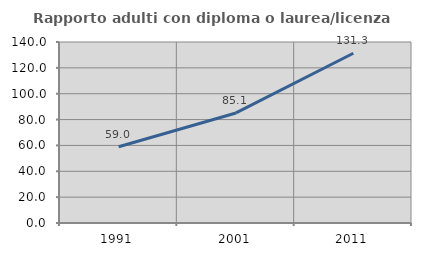
| Category | Rapporto adulti con diploma o laurea/licenza media  |
|---|---|
| 1991.0 | 59.018 |
| 2001.0 | 85.132 |
| 2011.0 | 131.315 |